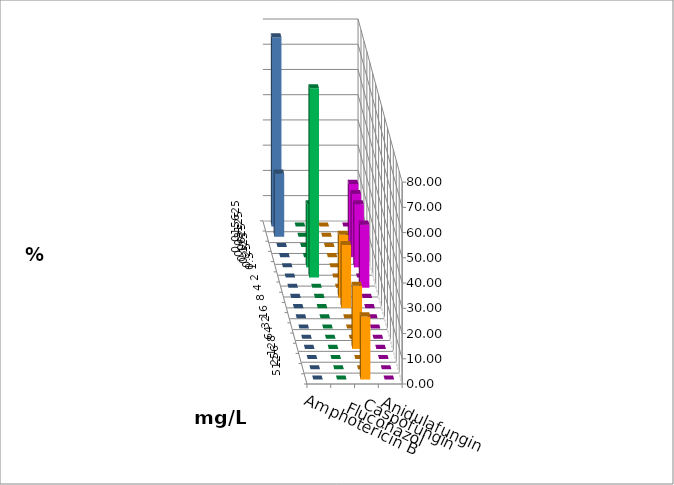
| Category | Amphotericin B | Fluconazol | Caspofungin | Anidulafungin |
|---|---|---|---|---|
| 0.015625 | 0 | 0 | 0 | 75 |
| 0.03125 | 0 | 0 | 0 | 25 |
| 0.0625 | 0 | 0 | 25 | 0 |
| 0.125 | 0 | 0 | 25 | 0 |
| 0.25 | 25 | 0 | 25 | 0 |
| 0.5 | 75 | 0 | 0 | 0 |
| 1.0 | 0 | 0 | 25 | 0 |
| 2.0 | 0 | 25 | 0 | 0 |
| 4.0 | 0 | 25 | 0 | 0 |
| 8.0 | 0 | 0 | 0 | 0 |
| 16.0 | 0 | 0 | 0 | 0 |
| 32.0 | 0 | 0 | 0 | 0 |
| 64.0 | 0 | 25 | 0 | 0 |
| 128.0 | 0 | 0 | 0 | 0 |
| 256.0 | 0 | 0 | 0 | 0 |
| 512.0 | 0 | 25 | 0 | 0 |